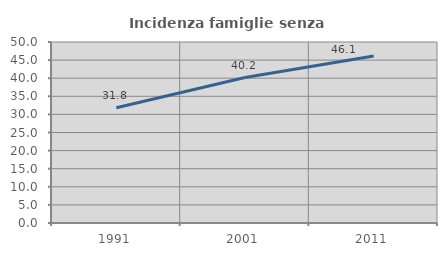
| Category | Incidenza famiglie senza nuclei |
|---|---|
| 1991.0 | 31.841 |
| 2001.0 | 40.175 |
| 2011.0 | 46.117 |